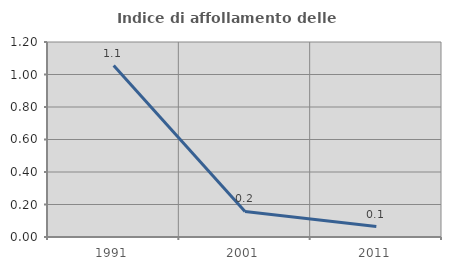
| Category | Indice di affollamento delle abitazioni  |
|---|---|
| 1991.0 | 1.055 |
| 2001.0 | 0.157 |
| 2011.0 | 0.065 |